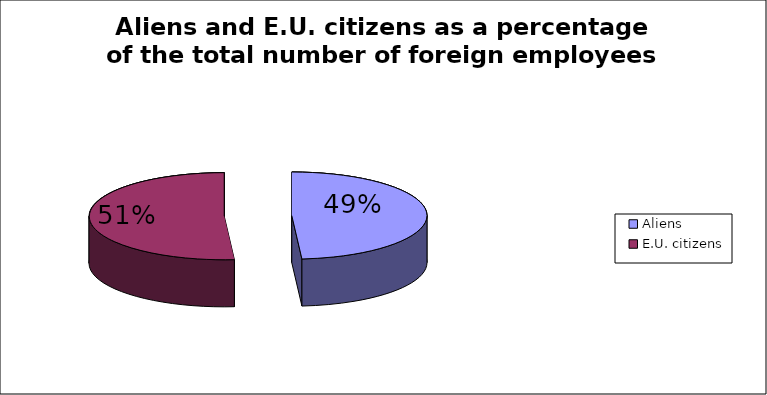
| Category | Series 0 |
|---|---|
| Aliens | 84539.75 |
| E.U. citizens | 88686 |